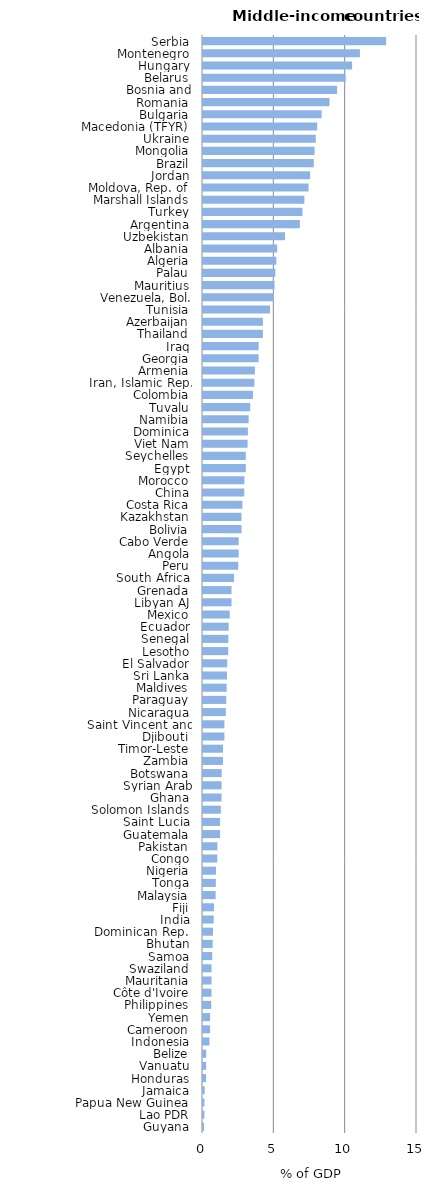
| Category | Series 0 |
|---|---|
| Guyana | 0.07 |
| Lao PDR | 0.097 |
| Papua New Guinea | 0.1 |
| Jamaica | 0.12 |
| Honduras | 0.21 |
| Vanuatu | 0.221 |
| Belize | 0.226 |
| Indonesia | 0.451 |
| Cameroon | 0.5 |
| Yemen | 0.5 |
| Philippines | 0.576 |
| Côte d'Ivoire | 0.6 |
| Mauritania | 0.6 |
| Swaziland | 0.6 |
| Samoa | 0.646 |
| Bhutan | 0.677 |
| Dominican Rep. | 0.7 |
| India | 0.747 |
| Fiji | 0.768 |
| Malaysia | 0.888 |
| Tonga | 0.896 |
| Nigeria | 0.91 |
| Congo | 1 |
| Pakistan | 1.009 |
| Guatemala | 1.2 |
| Saint Lucia | 1.2 |
| Solomon Islands | 1.252 |
| Ghana | 1.3 |
| Syrian Arab Republic | 1.3 |
| Botswana | 1.31 |
| Zambia | 1.4 |
| Timor-Leste | 1.404 |
| Djibouti | 1.5 |
| Saint Vincent and the Grenadines | 1.5 |
| Nicaragua | 1.6 |
| Paraguay | 1.63 |
| Maldives | 1.659 |
| Sri Lanka | 1.681 |
| El Salvador | 1.7 |
| Lesotho | 1.77 |
| Senegal | 1.78 |
| Ecuador | 1.8 |
| Mexico | 1.875 |
| Libyan AJ | 2 |
| Grenada | 2 |
| South Africa | 2.18 |
| Peru | 2.47 |
| Angola | 2.5 |
| Cabo Verde | 2.5 |
| Bolivia | 2.7 |
| Kazakhstan | 2.7 |
| Costa Rica | 2.76 |
| China | 2.894 |
| Morocco | 2.9 |
| Egypt | 3 |
| Seychelles | 3 |
| Viet Nam | 3.125 |
| Dominica | 3.146 |
| Namibia | 3.2 |
| Tuvalu | 3.309 |
| Colombia | 3.5 |
| Iran, Islamic Rep. of | 3.6 |
| Armenia | 3.638 |
| Georgia | 3.898 |
| Iraq | 3.9 |
| Thailand | 4.198 |
| Azerbaijan | 4.2 |
| Tunisia | 4.7 |
| Venezuela, Bol. Rep. | 4.98 |
| Mauritius | 5.016 |
| Palau | 5.071 |
| Algeria | 5.142 |
| Albania | 5.2 |
| Uzbekistan | 5.752 |
| Argentina | 6.79 |
| Turkey | 6.975 |
| Marshall Islands | 7.106 |
| Moldova, Rep. of | 7.4 |
| Jordan | 7.51 |
| Brazil | 7.764 |
| Mongolia | 7.821 |
| Ukraine | 7.904 |
| Macedonia (TFYR) | 8 |
| Bulgaria | 8.313 |
| Romania | 8.868 |
| Bosnia and Herzegovina | 9.4 |
| Belarus | 10 |
| Hungary | 10.453 |
| Montenegro | 11 |
| Serbia | 12.839 |